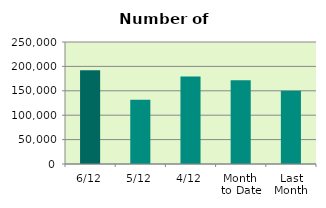
| Category | Series 0 |
|---|---|
| 6/12 | 192204 |
| 5/12 | 131776 |
| 4/12 | 179498 |
| Month 
to Date | 171506.5 |
| Last
Month | 150008.364 |